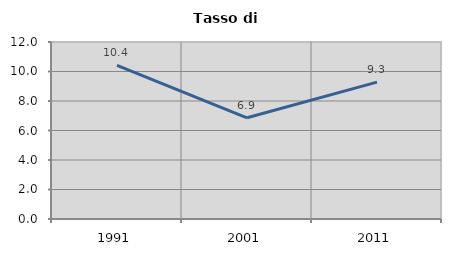
| Category | Tasso di disoccupazione   |
|---|---|
| 1991.0 | 10.422 |
| 2001.0 | 6.86 |
| 2011.0 | 9.283 |